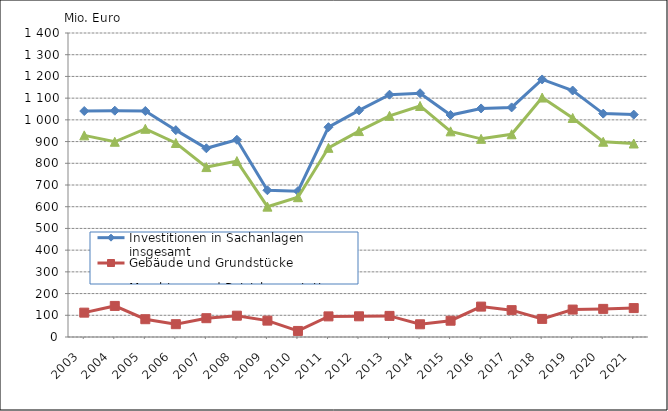
| Category | Investitionen in Sachanlagen insgesamt | Gebäude und Grundstücke | Maschinen und Betriebsausstattung |
|---|---|---|---|
| 2003.0 | 1040673 | 112131 | 928542 |
| 2004.0 | 1042199 | 143093 | 899107 |
| 2005.0 | 1040771 | 81943 | 958828 |
| 2006.0 | 952585 | 59050 | 893535 |
| 2007.0 | 869086 | 86618 | 782467 |
| 2008.0 | 908294 | 98112 | 810182 |
| 2009.0 | 675811 | 75418 | 600393 |
| 2010.0 | 671734.109 | 27895.396 | 643838.713 |
| 2011.0 | 966215.121 | 94979.882 | 871235.239 |
| 2012.0 | 1043637.405 | 95334.066 | 948303.339 |
| 2013.0 | 1115956.006 | 97198.2 | 1018757.806 |
| 2014.0 | 1122553.349 | 58554.558 | 1063998.791 |
| 2015.0 | 1022095.197 | 75014.669 | 947080.528 |
| 2016.0 | 1052570.21 | 139988.972 | 912581.238 |
| 2017.0 | 1057379.348 | 123665.469 | 933713.879 |
| 2018.0 | 1186108.837 | 83370.127 | 1102738.71 |
| 2019.0 | 1135086.868 | 126326.509 | 1008760.359 |
| 2020.0 | 1028738.464 | 129512.226 | 899226.238 |
| 2021.0 | 1024223.437 | 133155.781 | 891067.656 |